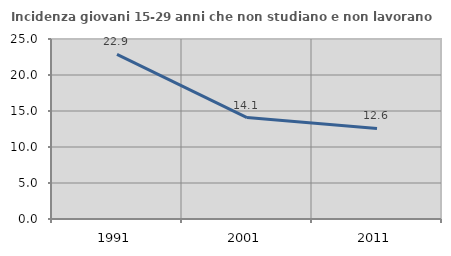
| Category | Incidenza giovani 15-29 anni che non studiano e non lavorano  |
|---|---|
| 1991.0 | 22.876 |
| 2001.0 | 14.082 |
| 2011.0 | 12.58 |